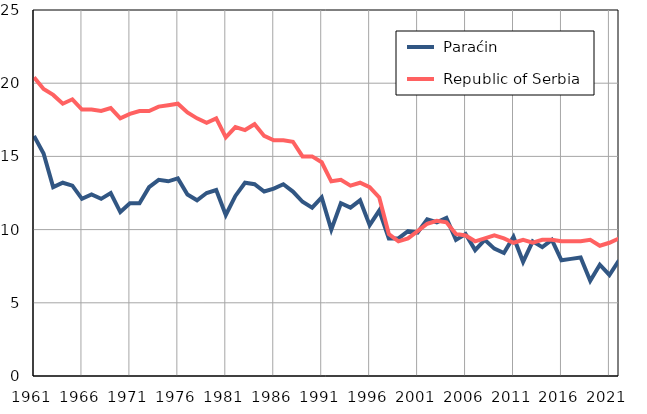
| Category |  Paraćin |  Republic of Serbia |
|---|---|---|
| 1961.0 | 16.4 | 20.4 |
| 1962.0 | 15.2 | 19.6 |
| 1963.0 | 12.9 | 19.2 |
| 1964.0 | 13.2 | 18.6 |
| 1965.0 | 13 | 18.9 |
| 1966.0 | 12.1 | 18.2 |
| 1967.0 | 12.4 | 18.2 |
| 1968.0 | 12.1 | 18.1 |
| 1969.0 | 12.5 | 18.3 |
| 1970.0 | 11.2 | 17.6 |
| 1971.0 | 11.8 | 17.9 |
| 1972.0 | 11.8 | 18.1 |
| 1973.0 | 12.9 | 18.1 |
| 1974.0 | 13.4 | 18.4 |
| 1975.0 | 13.3 | 18.5 |
| 1976.0 | 13.5 | 18.6 |
| 1977.0 | 12.4 | 18 |
| 1978.0 | 12 | 17.6 |
| 1979.0 | 12.5 | 17.3 |
| 1980.0 | 12.7 | 17.6 |
| 1981.0 | 11 | 16.3 |
| 1982.0 | 12.3 | 17 |
| 1983.0 | 13.2 | 16.8 |
| 1984.0 | 13.1 | 17.2 |
| 1985.0 | 12.6 | 16.4 |
| 1986.0 | 12.8 | 16.1 |
| 1987.0 | 13.1 | 16.1 |
| 1988.0 | 12.6 | 16 |
| 1989.0 | 11.9 | 15 |
| 1990.0 | 11.5 | 15 |
| 1991.0 | 12.2 | 14.6 |
| 1992.0 | 10 | 13.3 |
| 1993.0 | 11.8 | 13.4 |
| 1994.0 | 11.5 | 13 |
| 1995.0 | 12 | 13.2 |
| 1996.0 | 10.3 | 12.9 |
| 1997.0 | 11.3 | 12.2 |
| 1998.0 | 9.4 | 9.7 |
| 1999.0 | 9.4 | 9.2 |
| 2000.0 | 9.9 | 9.4 |
| 2001.0 | 9.8 | 9.9 |
| 2002.0 | 10.7 | 10.4 |
| 2003.0 | 10.5 | 10.6 |
| 2004.0 | 10.8 | 10.5 |
| 2005.0 | 9.3 | 9.7 |
| 2006.0 | 9.7 | 9.6 |
| 2007.0 | 8.6 | 9.2 |
| 2008.0 | 9.3 | 9.4 |
| 2009.0 | 8.7 | 9.6 |
| 2010.0 | 8.4 | 9.4 |
| 2011.0 | 9.5 | 9.1 |
| 2012.0 | 7.8 | 9.3 |
| 2013.0 | 9.2 | 9.1 |
| 2014.0 | 8.8 | 9.3 |
| 2015.0 | 9.3 | 9.3 |
| 2016.0 | 7.9 | 9.2 |
| 2017.0 | 8 | 9.2 |
| 2018.0 | 8.1 | 9.2 |
| 2019.0 | 6.5 | 9.3 |
| 2020.0 | 7.6 | 8.9 |
| 2021.0 | 6.9 | 9.1 |
| 2022.0 | 7.9 | 9.4 |